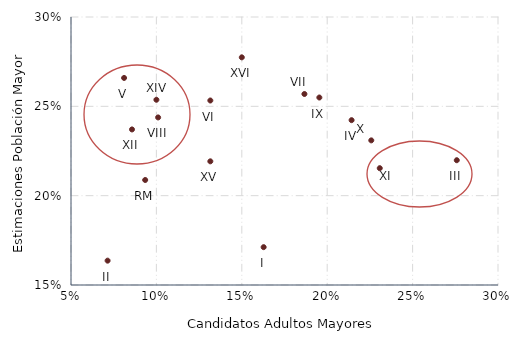
| Category | Estimaciones |
|---|---|
| 0.13157894736842105 | 0.219 |
| 0.16279069767441862 | 0.171 |
| 0.07142857142857142 | 0.164 |
| 0.27586206896551724 | 0.22 |
| 0.21428571428571427 | 0.242 |
| 0.08108108108108109 | 0.266 |
| 0.09343434343434344 | 0.209 |
| 0.13157894736842105 | 0.253 |
| 0.18666666666666668 | 0.257 |
| 0.15 | 0.277 |
| 0.10101010101010101 | 0.244 |
| 0.19540229885057472 | 0.255 |
| 0.1 | 0.254 |
| 0.22580645161290322 | 0.231 |
| 0.23076923076923078 | 0.215 |
| 0.08571428571428572 | 0.237 |